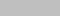
| Category | I feel my work is appreciated at the University |
|---|---|
| 0 | 6 |
| 1 | 15 |
| 2 | 11 |
| 3 | 2 |
| 4 | 2 |